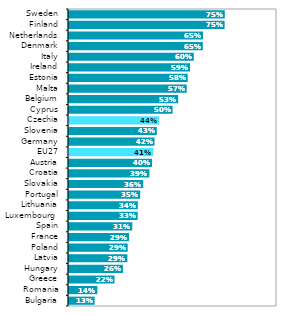
| Category | Series 0 |
|---|---|
| Bulgaria | 0.128 |
| Romania | 0.141 |
| Greece | 0.224 |
| Hungary | 0.264 |
| Latvia | 0.285 |
| Poland | 0.287 |
| France | 0.294 |
| Spain | 0.309 |
| Luxembourg  | 0.335 |
| Lithuania | 0.336 |
| Portugal | 0.347 |
| Slovakia | 0.361 |
| Croatia | 0.392 |
| Austria | 0.404 |
| EU27 | 0.41 |
| Germany | 0.416 |
| Slovenia | 0.427 |
| Czechia | 0.438 |
| Cyprus | 0.503 |
| Belgium | 0.53 |
| Malta | 0.571 |
| Estonia | 0.575 |
| Ireland | 0.587 |
| Italy | 0.605 |
| Denmark | 0.648 |
| Netherlands | 0.649 |
| Finland | 0.753 |
| Sweden | 0.754 |